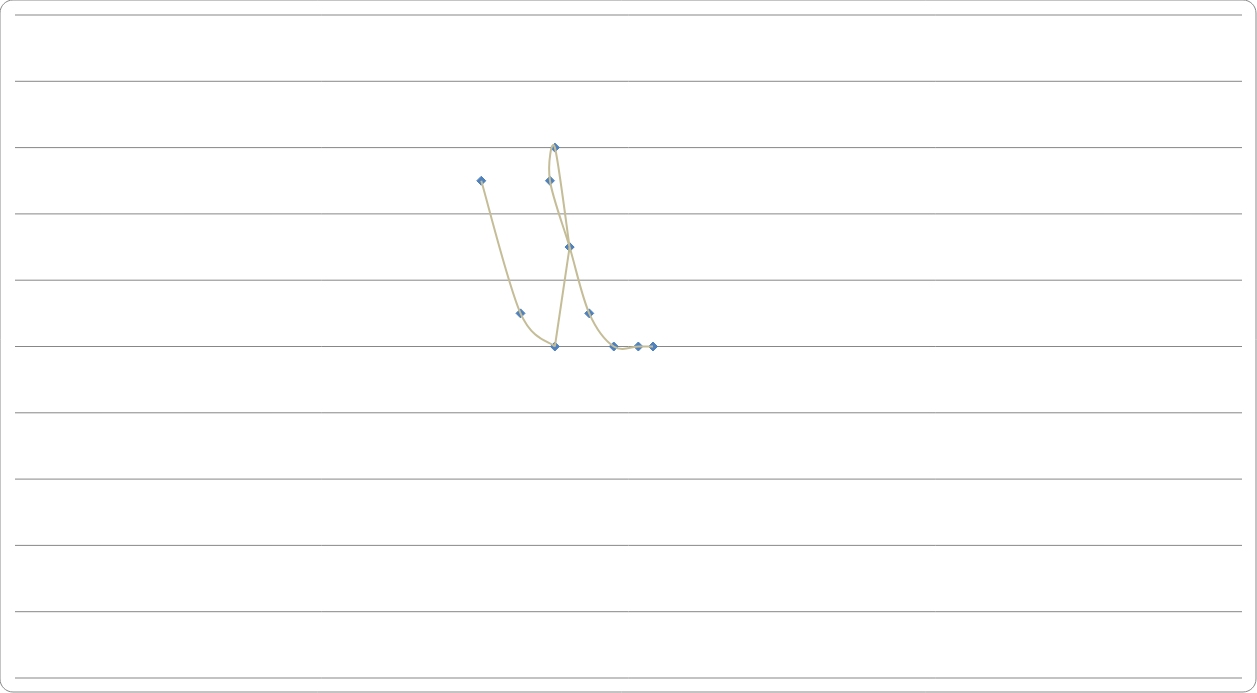
| Category | Series 0 |
|---|---|
| 47.0 | 25 |
| 47.3 | 25 |
| 47.8 | 25 |
| 48.3 | 25.1 |
| 48.7 | 25.3 |
| 49.1 | 25.5 |
| 49.0 | 25.6 |
| 48.7 | 25.3 |
| 49.0 | 25 |
| 49.7 | 25.1 |
| 50.5 | 25.5 |